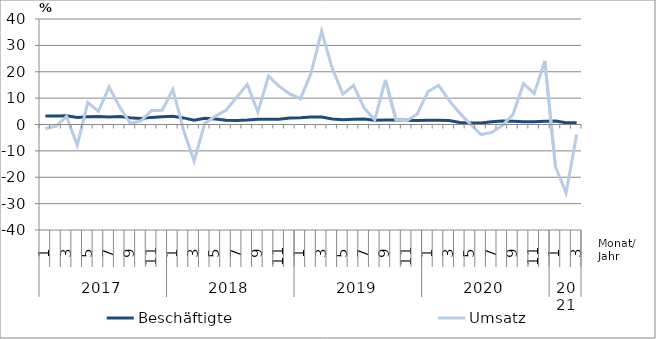
| Category | Beschäftigte | Umsatz |
|---|---|---|
| 0 | 3.2 | -1.5 |
| 1 | 3.2 | -0.7 |
| 2 | 3.3 | 3.1 |
| 3 | 2.7 | -7.9 |
| 4 | 2.9 | 8.4 |
| 5 | 3 | 5 |
| 6 | 2.8 | 14.2 |
| 7 | 3 | 6.6 |
| 8 | 2.6 | 0.4 |
| 9 | 2.3 | 1.4 |
| 10 | 2.7 | 5.3 |
| 11 | 2.9 | 5.4 |
| 12 | 3.1 | 13.3 |
| 13 | 2.5 | -2 |
| 14 | 1.6 | -13.9 |
| 15 | 2.4 | 0.4 |
| 16 | 2.1 | 3.2 |
| 17 | 1.6 | 5.4 |
| 18 | 1.5 | 10.3 |
| 19 | 1.7 | 15.2 |
| 20 | 2 | 4.7 |
| 21 | 2 | 18.4 |
| 22 | 2 | 14.5 |
| 23 | 2.5 | 11.6 |
| 24 | 2.6 | 9.8 |
| 25 | 2.8 | 19.4 |
| 26 | 2.8 | 35.4 |
| 27 | 2.1 | 21.3 |
| 28 | 1.8 | 11.5 |
| 29 | 2 | 14.8 |
| 30 | 2.1 | 6.3 |
| 31 | 1.6 | 1.7 |
| 32 | 1.7 | 16.9 |
| 33 | 1.7 | 1.8 |
| 34 | 1.6 | 1.4 |
| 35 | 1.5 | 4 |
| 36 | 1.6 | 12.4 |
| 37 | 1.6 | 14.9 |
| 38 | 1.5 | 9.1 |
| 39 | 0.8 | 4.3 |
| 40 | 0.6 | 0.1 |
| 41 | 0.6 | -3.8 |
| 42 | 1 | -3 |
| 43 | 1.3 | -0.4 |
| 44 | 1.2 | 3.8 |
| 45 | 1 | 15.5 |
| 46 | 1 | 11.7 |
| 47 | 1.2 | 24.1 |
| 48 | 1.3 | -15.9 |
| 49 | 0.7 | -25.9 |
| 50 | 0.7 | -3.8 |